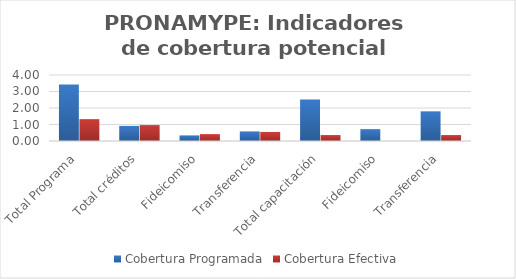
| Category | Cobertura Programada | Cobertura Efectiva |
|---|---|---|
| Total Programa | 3.431 | 1.325 |
| Total créditos | 0.915 | 0.964 |
| Fideicomiso | 0.339 | 0.415 |
| Transferencia | 0.575 | 0.549 |
| Total capacitación | 2.516 | 0.36 |
| Fideicomiso | 0.718 | 0 |
| Transferencia | 1.798 | 0.36 |